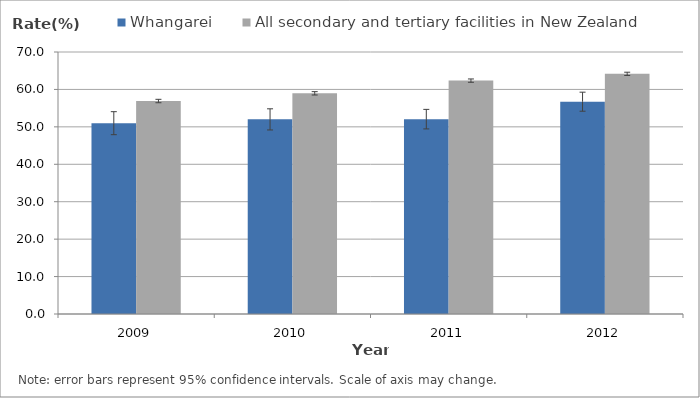
| Category | Whangarei | All secondary and tertiary facilities in New Zealand |
|---|---|---|
| 2009.0 | 50.986 | 56.902 |
| 2010.0 | 52.003 | 58.962 |
| 2011.0 | 52.066 | 62.354 |
| 2012.0 | 56.74 | 64.169 |